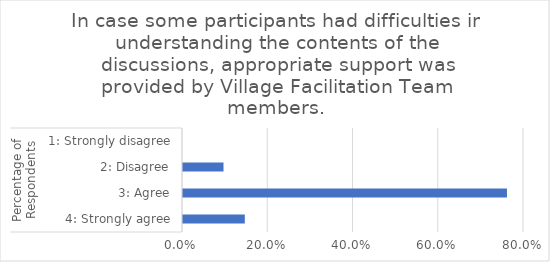
| Category | In case some participants had difficulties in understanding the contents of the discussions, appropriate support was provided by Village Facilitation Team members. |
|---|---|
| 0 | 0.145 |
| 1 | 0.76 |
| 2 | 0.095 |
| 3 | 0 |